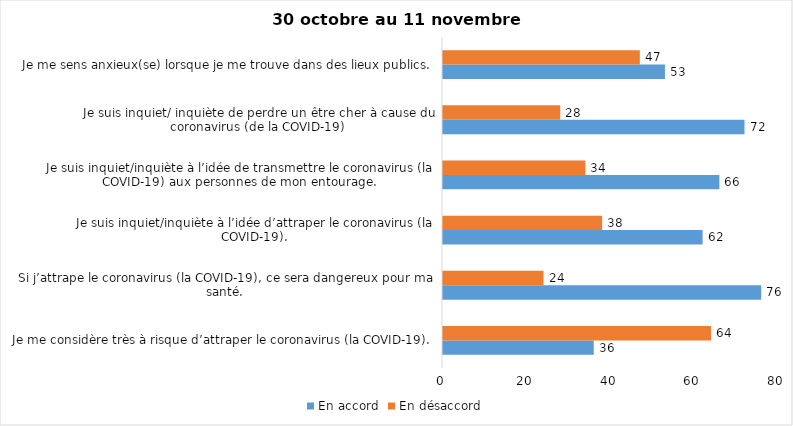
| Category | En accord | En désaccord |
|---|---|---|
| Je me considère très à risque d’attraper le coronavirus (la COVID-19). | 36 | 64 |
| Si j’attrape le coronavirus (la COVID-19), ce sera dangereux pour ma santé. | 76 | 24 |
| Je suis inquiet/inquiète à l’idée d’attraper le coronavirus (la COVID-19). | 62 | 38 |
| Je suis inquiet/inquiète à l’idée de transmettre le coronavirus (la COVID-19) aux personnes de mon entourage. | 66 | 34 |
| Je suis inquiet/ inquiète de perdre un être cher à cause du coronavirus (de la COVID-19) | 72 | 28 |
| Je me sens anxieux(se) lorsque je me trouve dans des lieux publics. | 53 | 47 |